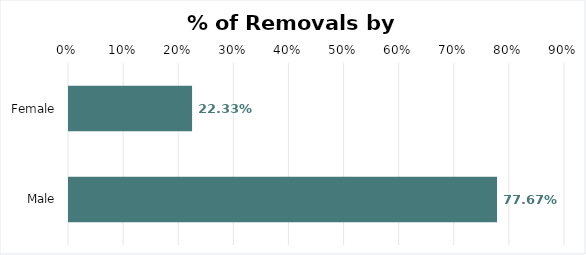
| Category | % of Total Removals |
|---|---|
| Female | 0.223 |
| Male | 0.777 |